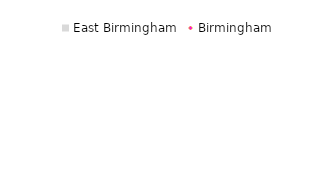
| Category | East Birmingham |
|---|---|
| Detached | -1.78 |
| Semi-detached | 3.614 |
| Terraced | -6.283 |
| Flat (purpose built) | -0.698 |
| Other flats & moblile homes | -3.778 |